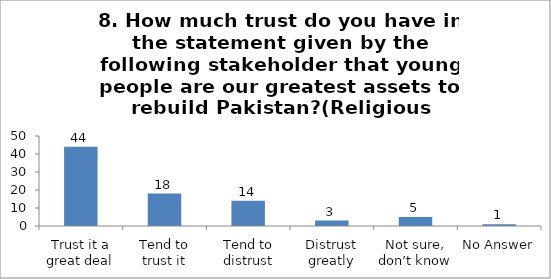
| Category | 8. How much trust do you have in the statement given by the following stakeholder that young people are our greatest assets to rebuild Pakistan?(Religious Leaders) |
|---|---|
| Trust it a great deal | 44 |
| Tend to trust it | 18 |
| Tend to distrust | 14 |
| Distrust greatly | 3 |
| Not sure, don’t know | 5 |
| No Answer | 1 |